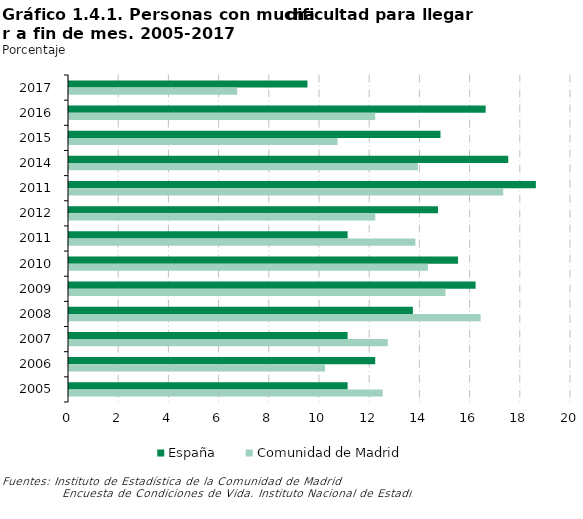
| Category | España | Comunidad de Madrid |
|---|---|---|
| 2017 | 9.5 | 6.7 |
| 2016 | 16.6 | 12.2 |
| 2015 | 14.8 | 10.7 |
| 2014 | 17.5 | 13.9 |
| 2011 | 18.6 | 17.3 |
| 2012 | 14.7 | 12.2 |
| 2011 | 11.1 | 13.8 |
| 2010 | 15.5 | 14.3 |
| 2009 | 16.2 | 15 |
| 2008 | 13.7 | 16.4 |
| 2007 | 11.1 | 12.7 |
| 2006 | 12.2 | 10.2 |
| 2005 | 11.1 | 12.5 |